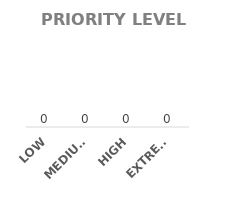
| Category | QTY |
|---|---|
| LOW | 0 |
| MEDIUM | 0 |
| HIGH | 0 |
| EXTREME | 0 |